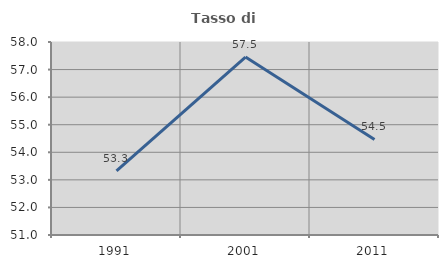
| Category | Tasso di occupazione   |
|---|---|
| 1991.0 | 53.329 |
| 2001.0 | 57.453 |
| 2011.0 | 54.468 |